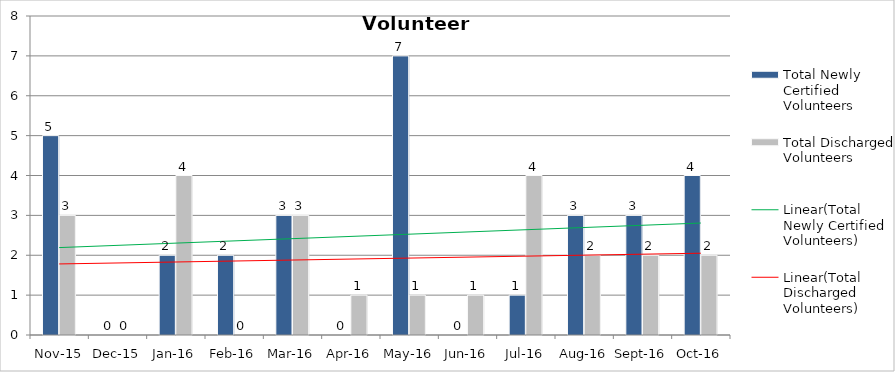
| Category | Total Newly Certified Volunteers | Total Discharged Volunteers |
|---|---|---|
| Nov-15 | 5 | 3 |
| Dec-15 | 0 | 0 |
| Jan-16 | 2 | 4 |
| Feb-16 | 2 | 0 |
| Mar-16 | 3 | 3 |
| Apr-16 | 0 | 1 |
| May-16 | 7 | 1 |
| Jun-16 | 0 | 1 |
| Jul-16 | 1 | 4 |
| Aug-16 | 3 | 2 |
| Sep-16 | 3 | 2 |
| Oct-16 | 4 | 2 |